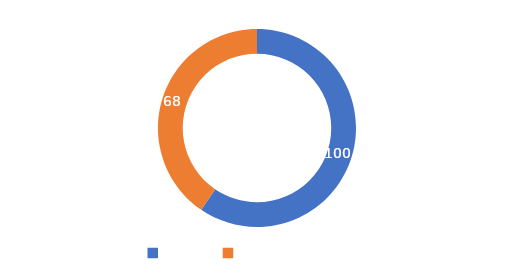
| Category | Series 0 |
|---|---|
| META  | 100 |
| CUMPLIMIENTO | 68 |